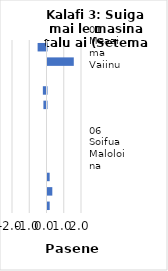
| Category | All items - m-m changes |
|---|---|
| 01 Meaai ma Vaiinu | -0.516 |
| 07 Femalagaiga | 1.524 |
| 11 Faleaiga | 0 |
| 03 Lavalava ma Seevae | -0.211 |
| 12 Isi Oloa ma Auaunaga | -0.179 |
| 08 Fesootaiga | 0 |
| 09 Faafiafiaga ma Aganuu | 0 |
| 06 Soifua Maloloina | 0 |
| 10 Aoaoga | 0 |
| 02 Ava Malosi ma Tapaa | 0.126 |
| 05 Meafale, Mea Faigaleuga mo Faaleleia o Aiga | 0.279 |
| 04 Fale, Suavai, Eletise, Kesi ma isi | 0.127 |